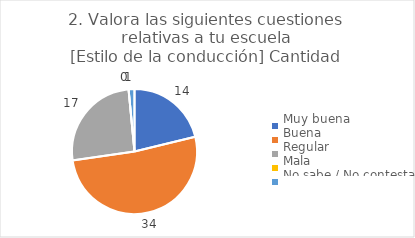
| Category | 2. Valora las siguientes cuestiones relativas a tu escuela
[Estilo de la conducción] |
|---|---|
| Muy buena  | 0.212 |
| Buena  | 0.515 |
| Regular  | 0.258 |
| Mala  | 0 |
| No sabe / No contesta | 0.015 |